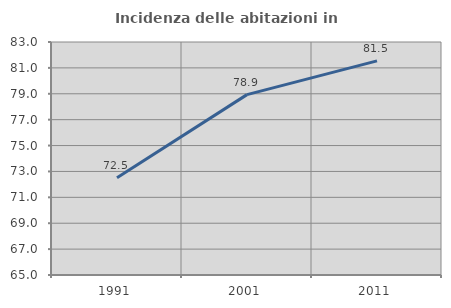
| Category | Incidenza delle abitazioni in proprietà  |
|---|---|
| 1991.0 | 72.512 |
| 2001.0 | 78.934 |
| 2011.0 | 81.538 |